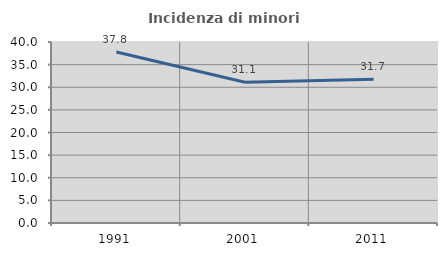
| Category | Incidenza di minori stranieri |
|---|---|
| 1991.0 | 37.805 |
| 2001.0 | 31.099 |
| 2011.0 | 31.742 |